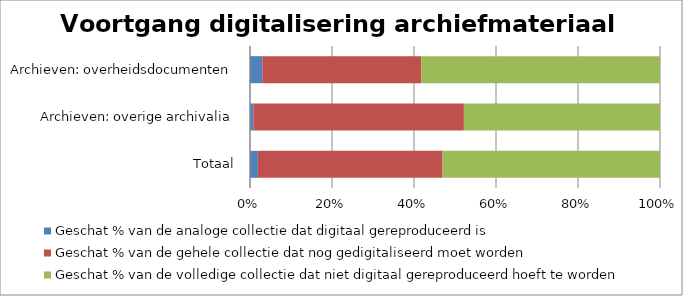
| Category | Geschat % van de analoge collectie dat digitaal gereproduceerd is  | Geschat % van de gehele collectie dat nog gedigitaliseerd moet worden | Geschat % van de volledige collectie dat niet digitaal gereproduceerd hoeft te worden |
|---|---|---|---|
| Totaal | 1.917 | 45.042 | 53.042 |
| Archieven: overige archivalia | 0.833 | 51.333 | 47.833 |
| Archieven: overheidsdocumenten | 3 | 38.75 | 58.25 |